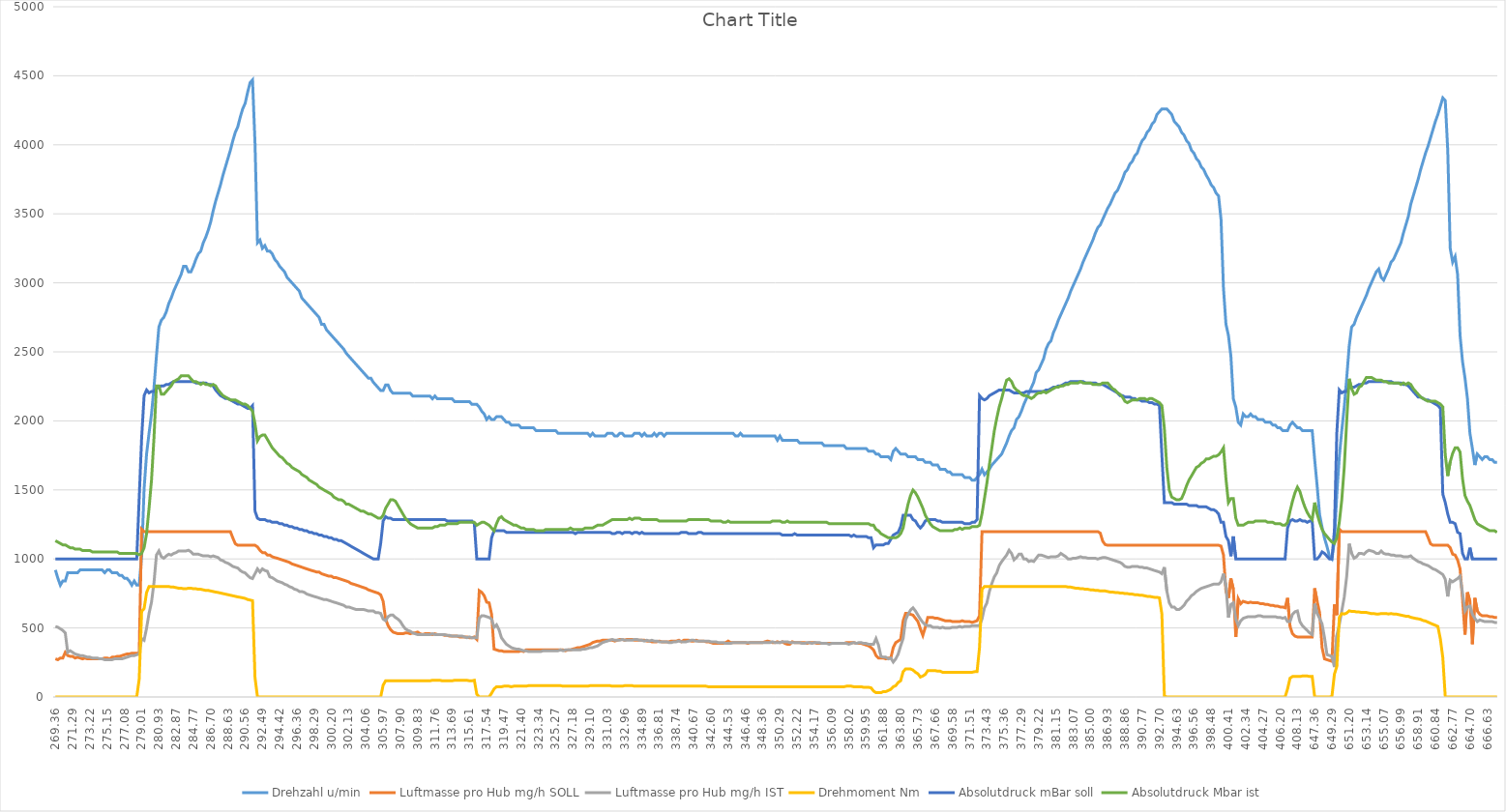
| Category | Drehzahl u/min | Luftmasse pro Hub mg/h SOLL | Luftmasse pro Hub mg/h IST | Drehmoment Nm | Absolutdruck mBar soll | Absolutdruck Mbar ist |
|---|---|---|---|---|---|---|
| 269.36 | 920 | 276 | 511 | 0 | 1000 | 1132 |
| 269.63 | 860 | 270 | 505 | 0 | 1000 | 1122 |
| 269.92 | 810 | 282 | 494 | 0 | 1000 | 1112 |
| 270.19 | 840 | 282 | 482 | 0 | 1000 | 1102 |
| 270.46 | 840 | 323 | 464 | 0 | 1000 | 1102 |
| 270.75 | 900 | 300 | 323 | 0 | 1000 | 1091 |
| 271.02 | 900 | 294 | 335 | 0 | 1000 | 1081 |
| 271.29 | 900 | 294 | 323 | 0 | 1000 | 1081 |
| 271.56 | 900 | 282 | 311 | 0 | 1000 | 1071 |
| 271.85 | 900 | 288 | 306 | 0 | 1000 | 1071 |
| 272.12 | 920 | 282 | 300 | 0 | 1000 | 1071 |
| 272.39 | 920 | 276 | 300 | 0 | 1000 | 1061 |
| 272.66 | 920 | 282 | 294 | 0 | 1000 | 1061 |
| 272.95 | 920 | 276 | 288 | 0 | 1000 | 1061 |
| 273.22 | 920 | 276 | 288 | 0 | 1000 | 1061 |
| 273.49 | 920 | 276 | 282 | 0 | 1000 | 1051 |
| 273.78 | 920 | 276 | 282 | 0 | 1000 | 1051 |
| 274.05 | 920 | 276 | 282 | 0 | 1000 | 1051 |
| 274.32 | 920 | 276 | 276 | 0 | 1000 | 1051 |
| 274.59 | 920 | 276 | 276 | 0 | 1000 | 1051 |
| 274.88 | 900 | 282 | 270 | 0 | 1000 | 1051 |
| 275.15 | 920 | 282 | 270 | 0 | 1000 | 1051 |
| 275.42 | 920 | 276 | 270 | 0 | 1000 | 1051 |
| 275.69 | 900 | 288 | 270 | 0 | 1000 | 1051 |
| 275.98 | 900 | 288 | 276 | 0 | 1000 | 1051 |
| 276.25 | 900 | 294 | 276 | 0 | 1000 | 1051 |
| 276.52 | 880 | 294 | 276 | 0 | 1000 | 1040 |
| 276.81 | 880 | 300 | 276 | 0 | 1000 | 1040 |
| 277.08 | 860 | 306 | 282 | 0 | 1000 | 1040 |
| 277.35 | 860 | 311 | 288 | 0 | 1000 | 1040 |
| 277.62 | 840 | 311 | 294 | 0 | 1000 | 1040 |
| 277.91 | 810 | 317 | 300 | 0 | 1000 | 1040 |
| 278.17 | 840 | 317 | 300 | 0 | 1000 | 1040 |
| 278.45 | 810 | 317 | 306 | 0 | 1000 | 1040 |
| 278.71 | 810 | 317 | 311 | 129 | 1438 | 1030 |
| 279.01 | 1020 | 1216 | 423 | 620 | 1877 | 1040 |
| 279.27 | 1510 | 1198 | 411 | 640 | 2183 | 1081 |
| 279.54 | 1760 | 1198 | 499 | 757 | 2224 | 1183 |
| 279.83 | 1910 | 1198 | 605 | 800 | 2203 | 1367 |
| 280.11 | 2050 | 1198 | 687 | 800 | 2213 | 1571 |
| 280.38 | 2240 | 1198 | 828 | 800 | 2213 | 1877 |
| 280.64 | 2470 | 1198 | 1028 | 800 | 2234 | 2254 |
| 280.93 | 2680 | 1198 | 1058 | 800 | 2244 | 2254 |
| 281.21 | 2730 | 1198 | 1016 | 800 | 2254 | 2193 |
| 281.47 | 2750 | 1198 | 1005 | 800 | 2254 | 2193 |
| 281.74 | 2790 | 1198 | 1022 | 800 | 2264 | 2213 |
| 282.03 | 2850 | 1198 | 1034 | 800 | 2264 | 2234 |
| 282.30 | 2890 | 1198 | 1028 | 796 | 2275 | 2254 |
| 282.57 | 2940 | 1198 | 1040 | 796 | 2285 | 2285 |
| 282.87 | 2980 | 1198 | 1046 | 792 | 2285 | 2295 |
| 283.13 | 3020 | 1198 | 1058 | 788 | 2285 | 2305 |
| 283.40 | 3060 | 1198 | 1058 | 788 | 2285 | 2326 |
| 283.67 | 3120 | 1198 | 1058 | 784 | 2285 | 2326 |
| 283.96 | 3120 | 1198 | 1058 | 784 | 2285 | 2326 |
| 284.23 | 3080 | 1198 | 1063 | 788 | 2285 | 2326 |
| 284.50 | 3080 | 1198 | 1052 | 788 | 2285 | 2305 |
| 284.77 | 3120 | 1198 | 1034 | 784 | 2285 | 2285 |
| 285.06 | 3170 | 1198 | 1034 | 784 | 2275 | 2285 |
| 285.33 | 3210 | 1198 | 1034 | 780 | 2275 | 2275 |
| 285.60 | 3230 | 1198 | 1028 | 780 | 2275 | 2264 |
| 285.89 | 3290 | 1198 | 1022 | 776 | 2275 | 2275 |
| 286.16 | 3330 | 1198 | 1022 | 772 | 2275 | 2264 |
| 286.43 | 3380 | 1198 | 1022 | 772 | 2264 | 2264 |
| 286.70 | 3440 | 1198 | 1016 | 768 | 2264 | 2254 |
| 286.99 | 3520 | 1198 | 1022 | 764 | 2254 | 2264 |
| 287.26 | 3590 | 1198 | 1016 | 760 | 2224 | 2254 |
| 287.53 | 3650 | 1198 | 1010 | 757 | 2203 | 2224 |
| 287.80 | 3710 | 1198 | 993 | 753 | 2183 | 2203 |
| 288.09 | 3780 | 1198 | 987 | 749 | 2173 | 2183 |
| 288.36 | 3840 | 1198 | 975 | 745 | 2162 | 2173 |
| 288.63 | 3900 | 1198 | 969 | 741 | 2162 | 2162 |
| 288.92 | 3960 | 1198 | 958 | 737 | 2152 | 2152 |
| 289.19 | 4030 | 1152 | 946 | 733 | 2142 | 2152 |
| 289.46 | 4090 | 1110 | 940 | 729 | 2132 | 2152 |
| 289.73 | 4130 | 1099 | 934 | 725 | 2122 | 2142 |
| 290.02 | 4200 | 1099 | 916 | 722 | 2122 | 2132 |
| 290.29 | 4260 | 1099 | 905 | 718 | 2111 | 2122 |
| 290.56 | 4300 | 1099 | 899 | 714 | 2101 | 2122 |
| 290.83 | 4380 | 1099 | 881 | 706 | 2091 | 2111 |
| 291.12 | 4450 | 1099 | 864 | 702 | 2091 | 2091 |
| 291.39 | 4470 | 1099 | 858 | 698 | 2111 | 2071 |
| 291.66 | 4010 | 1099 | 893 | 140 | 1346 | 1979 |
| 291.95 | 3290 | 1087 | 928 | 0 | 1295 | 1856 |
| 292.22 | 3310 | 1063 | 905 | 0 | 1285 | 1887 |
| 292.49 | 3250 | 1046 | 928 | 0 | 1285 | 1897 |
| 292.76 | 3270 | 1046 | 916 | 0 | 1285 | 1897 |
| 293.05 | 3230 | 1028 | 911 | 0 | 1275 | 1867 |
| 293.32 | 3230 | 1028 | 870 | 0 | 1275 | 1836 |
| 293.59 | 3210 | 1016 | 864 | 0 | 1265 | 1805 |
| 293.87 | 3170 | 1010 | 852 | 0 | 1265 | 1785 |
| 294.15 | 3150 | 1005 | 840 | 0 | 1265 | 1765 |
| 294.42 | 3120 | 999 | 834 | 0 | 1255 | 1744 |
| 294.69 | 3100 | 993 | 828 | 0 | 1255 | 1734 |
| 294.98 | 3080 | 987 | 817 | 0 | 1244 | 1714 |
| 295.25 | 3040 | 981 | 811 | 0 | 1244 | 1693 |
| 295.53 | 3020 | 975 | 799 | 0 | 1234 | 1683 |
| 295.79 | 3000 | 964 | 793 | 0 | 1234 | 1663 |
| 296.09 | 2980 | 958 | 781 | 0 | 1224 | 1652 |
| 296.36 | 2960 | 952 | 776 | 0 | 1224 | 1642 |
| 296.63 | 2940 | 946 | 764 | 0 | 1214 | 1632 |
| 296.89 | 2890 | 940 | 764 | 0 | 1214 | 1612 |
| 297.19 | 2870 | 934 | 758 | 0 | 1204 | 1601 |
| 297.46 | 2850 | 928 | 746 | 0 | 1204 | 1591 |
| 297.72 | 2830 | 922 | 740 | 0 | 1193 | 1571 |
| 298.01 | 2810 | 916 | 734 | 0 | 1193 | 1561 |
| 298.29 | 2790 | 911 | 728 | 0 | 1183 | 1550 |
| 298.55 | 2770 | 905 | 723 | 0 | 1183 | 1540 |
| 298.82 | 2750 | 905 | 717 | 0 | 1173 | 1520 |
| 299.11 | 2700 | 893 | 711 | 0 | 1173 | 1510 |
| 299.38 | 2700 | 887 | 705 | 0 | 1163 | 1499 |
| 299.65 | 2660 | 881 | 705 | 0 | 1163 | 1489 |
| 299.92 | 2640 | 875 | 699 | 0 | 1153 | 1479 |
| 300.20 | 2620 | 875 | 693 | 0 | 1153 | 1469 |
| 300.48 | 2600 | 864 | 687 | 0 | 1142 | 1448 |
| 300.74 | 2580 | 864 | 682 | 0 | 1142 | 1438 |
| 301.03 | 2560 | 858 | 676 | 0 | 1132 | 1428 |
| 301.30 | 2540 | 852 | 670 | 0 | 1132 | 1428 |
| 301.57 | 2520 | 846 | 664 | 0 | 1122 | 1418 |
| 301.84 | 2490 | 840 | 652 | 0 | 1112 | 1397 |
| 302.13 | 2470 | 834 | 652 | 0 | 1102 | 1397 |
| 302.40 | 2450 | 822 | 646 | 0 | 1091 | 1387 |
| 302.67 | 2430 | 817 | 640 | 0 | 1081 | 1377 |
| 302.94 | 2410 | 811 | 634 | 0 | 1071 | 1367 |
| 303.23 | 2390 | 805 | 634 | 0 | 1061 | 1357 |
| 303.51 | 2370 | 799 | 634 | 0 | 1051 | 1346 |
| 303.77 | 2350 | 793 | 634 | 0 | 1040 | 1346 |
| 304.06 | 2330 | 787 | 629 | 0 | 1030 | 1336 |
| 304.33 | 2310 | 776 | 623 | 0 | 1020 | 1326 |
| 304.60 | 2310 | 770 | 623 | 0 | 1010 | 1326 |
| 304.87 | 2280 | 764 | 623 | 0 | 1000 | 1316 |
| 305.16 | 2260 | 758 | 611 | 0 | 1000 | 1306 |
| 305.43 | 2240 | 752 | 611 | 0 | 1000 | 1295 |
| 305.70 | 2220 | 740 | 605 | 0 | 1112 | 1295 |
| 305.97 | 2220 | 693 | 564 | 86 | 1275 | 1316 |
| 306.26 | 2260 | 564 | 552 | 117 | 1306 | 1367 |
| 306.53 | 2260 | 517 | 582 | 117 | 1295 | 1397 |
| 306.80 | 2220 | 488 | 593 | 117 | 1295 | 1428 |
| 307.09 | 2200 | 470 | 593 | 117 | 1285 | 1428 |
| 307.36 | 2200 | 464 | 576 | 117 | 1285 | 1418 |
| 307.63 | 2200 | 458 | 564 | 117 | 1285 | 1387 |
| 307.90 | 2200 | 458 | 546 | 117 | 1285 | 1357 |
| 308.19 | 2200 | 458 | 517 | 117 | 1285 | 1326 |
| 308.46 | 2200 | 464 | 494 | 117 | 1285 | 1295 |
| 308.73 | 2200 | 464 | 482 | 117 | 1285 | 1275 |
| 309.00 | 2200 | 458 | 476 | 117 | 1285 | 1255 |
| 309.29 | 2180 | 464 | 464 | 117 | 1285 | 1244 |
| 309.56 | 2180 | 464 | 458 | 117 | 1285 | 1234 |
| 309.83 | 2180 | 470 | 452 | 117 | 1285 | 1224 |
| 310.12 | 2180 | 458 | 452 | 117 | 1285 | 1224 |
| 310.39 | 2180 | 452 | 452 | 117 | 1285 | 1224 |
| 310.66 | 2180 | 458 | 452 | 117 | 1285 | 1224 |
| 310.93 | 2180 | 458 | 452 | 117 | 1285 | 1224 |
| 311.22 | 2180 | 458 | 452 | 117 | 1285 | 1224 |
| 311.49 | 2160 | 452 | 458 | 121 | 1285 | 1224 |
| 311.76 | 2180 | 458 | 452 | 121 | 1285 | 1234 |
| 312.02 | 2160 | 452 | 452 | 121 | 1285 | 1234 |
| 312.31 | 2160 | 452 | 452 | 121 | 1285 | 1244 |
| 312.58 | 2160 | 452 | 452 | 117 | 1285 | 1244 |
| 312.86 | 2160 | 446 | 452 | 117 | 1285 | 1244 |
| 313.15 | 2160 | 446 | 446 | 117 | 1275 | 1255 |
| 313.41 | 2160 | 441 | 446 | 117 | 1275 | 1255 |
| 313.69 | 2160 | 441 | 441 | 117 | 1275 | 1255 |
| 313.96 | 2140 | 441 | 441 | 121 | 1275 | 1255 |
| 314.25 | 2140 | 441 | 441 | 121 | 1275 | 1255 |
| 314.51 | 2140 | 435 | 441 | 121 | 1275 | 1265 |
| 314.78 | 2140 | 435 | 441 | 121 | 1275 | 1265 |
| 315.05 | 2140 | 435 | 435 | 121 | 1275 | 1265 |
| 315.35 | 2140 | 435 | 429 | 121 | 1275 | 1265 |
| 315.61 | 2140 | 429 | 435 | 117 | 1275 | 1265 |
| 315.88 | 2120 | 429 | 429 | 117 | 1275 | 1265 |
| 316.17 | 2120 | 435 | 429 | 121 | 1255 | 1265 |
| 316.44 | 2120 | 417 | 429 | 20 | 1000 | 1244 |
| 316.71 | 2100 | 770 | 570 | 0 | 1000 | 1255 |
| 316.98 | 2070 | 758 | 588 | 0 | 1000 | 1265 |
| 317.27 | 2050 | 734 | 588 | 0 | 1000 | 1265 |
| 317.54 | 2010 | 687 | 582 | 0 | 1000 | 1255 |
| 317.81 | 2030 | 682 | 576 | 0 | 1000 | 1244 |
| 318.09 | 2010 | 599 | 564 | 27 | 1153 | 1224 |
| 318.37 | 2010 | 347 | 505 | 58 | 1204 | 1204 |
| 318.64 | 2030 | 341 | 523 | 74 | 1204 | 1255 |
| 318.91 | 2030 | 335 | 488 | 74 | 1204 | 1295 |
| 319.20 | 2030 | 335 | 429 | 74 | 1204 | 1306 |
| 319.47 | 2010 | 329 | 405 | 78 | 1204 | 1285 |
| 319.74 | 1990 | 329 | 382 | 78 | 1193 | 1275 |
| 320.01 | 1990 | 329 | 370 | 78 | 1193 | 1265 |
| 320.30 | 1970 | 329 | 358 | 74 | 1193 | 1255 |
| 320.57 | 1970 | 329 | 352 | 78 | 1193 | 1244 |
| 320.84 | 1970 | 329 | 347 | 78 | 1193 | 1244 |
| 321.11 | 1970 | 329 | 347 | 78 | 1193 | 1234 |
| 321.40 | 1950 | 335 | 341 | 78 | 1193 | 1224 |
| 321.67 | 1950 | 329 | 335 | 78 | 1193 | 1224 |
| 321.94 | 1950 | 341 | 335 | 78 | 1193 | 1214 |
| 322.23 | 1950 | 341 | 329 | 82 | 1193 | 1214 |
| 322.50 | 1950 | 341 | 329 | 82 | 1193 | 1214 |
| 322.77 | 1950 | 341 | 329 | 82 | 1193 | 1214 |
| 323.04 | 1930 | 341 | 329 | 82 | 1193 | 1204 |
| 323.34 | 1930 | 341 | 329 | 82 | 1193 | 1204 |
| 323.60 | 1930 | 341 | 329 | 82 | 1193 | 1204 |
| 323.88 | 1930 | 341 | 335 | 82 | 1193 | 1204 |
| 324.15 | 1930 | 341 | 335 | 82 | 1193 | 1214 |
| 324.44 | 1930 | 341 | 335 | 82 | 1193 | 1214 |
| 324.71 | 1930 | 341 | 335 | 82 | 1193 | 1214 |
| 324.98 | 1930 | 341 | 335 | 82 | 1193 | 1214 |
| 325.27 | 1930 | 341 | 335 | 82 | 1193 | 1214 |
| 325.54 | 1910 | 341 | 335 | 82 | 1193 | 1214 |
| 325.81 | 1910 | 341 | 341 | 82 | 1193 | 1214 |
| 326.08 | 1910 | 341 | 335 | 78 | 1193 | 1214 |
| 326.37 | 1910 | 335 | 341 | 78 | 1193 | 1214 |
| 326.64 | 1910 | 341 | 341 | 78 | 1193 | 1214 |
| 326.91 | 1910 | 341 | 341 | 78 | 1193 | 1224 |
| 327.18 | 1910 | 347 | 341 | 78 | 1193 | 1214 |
| 327.47 | 1910 | 352 | 341 | 78 | 1183 | 1214 |
| 327.74 | 1910 | 358 | 341 | 78 | 1193 | 1214 |
| 328.01 | 1910 | 358 | 341 | 78 | 1193 | 1214 |
| 328.29 | 1910 | 364 | 347 | 78 | 1193 | 1214 |
| 328.57 | 1910 | 370 | 347 | 78 | 1193 | 1224 |
| 328.84 | 1910 | 376 | 352 | 78 | 1193 | 1224 |
| 329.10 | 1890 | 382 | 358 | 82 | 1193 | 1224 |
| 329.39 | 1910 | 394 | 358 | 82 | 1193 | 1224 |
| 329.66 | 1890 | 400 | 364 | 82 | 1193 | 1234 |
| 329.93 | 1890 | 405 | 370 | 82 | 1193 | 1244 |
| 330.21 | 1890 | 405 | 382 | 82 | 1193 | 1244 |
| 330.49 | 1890 | 411 | 394 | 82 | 1193 | 1244 |
| 330.76 | 1890 | 411 | 400 | 82 | 1193 | 1255 |
| 331.03 | 1910 | 411 | 405 | 82 | 1193 | 1265 |
| 331.32 | 1910 | 411 | 411 | 82 | 1193 | 1275 |
| 331.59 | 1910 | 411 | 417 | 78 | 1183 | 1285 |
| 331.86 | 1890 | 405 | 411 | 78 | 1183 | 1285 |
| 332.13 | 1890 | 411 | 411 | 78 | 1193 | 1285 |
| 332.42 | 1910 | 417 | 411 | 78 | 1193 | 1285 |
| 332.69 | 1910 | 417 | 417 | 78 | 1183 | 1285 |
| 332.96 | 1890 | 411 | 411 | 82 | 1193 | 1285 |
| 333.23 | 1890 | 417 | 411 | 82 | 1193 | 1285 |
| 333.52 | 1890 | 417 | 411 | 82 | 1193 | 1295 |
| 333.79 | 1890 | 417 | 411 | 82 | 1183 | 1285 |
| 334.06 | 1910 | 411 | 417 | 78 | 1193 | 1295 |
| 334.35 | 1910 | 411 | 417 | 78 | 1193 | 1295 |
| 334.62 | 1910 | 411 | 411 | 78 | 1183 | 1295 |
| 334.89 | 1890 | 411 | 411 | 78 | 1193 | 1285 |
| 335.16 | 1910 | 411 | 405 | 78 | 1183 | 1285 |
| 335.44 | 1890 | 405 | 411 | 78 | 1183 | 1285 |
| 335.71 | 1890 | 405 | 405 | 78 | 1183 | 1285 |
| 335.98 | 1890 | 400 | 411 | 78 | 1183 | 1285 |
| 336.25 | 1910 | 400 | 405 | 78 | 1183 | 1285 |
| 336.54 | 1890 | 400 | 405 | 78 | 1183 | 1285 |
| 336.81 | 1910 | 405 | 400 | 78 | 1183 | 1275 |
| 337.08 | 1910 | 400 | 400 | 78 | 1183 | 1275 |
| 337.37 | 1890 | 400 | 400 | 78 | 1183 | 1275 |
| 337.64 | 1910 | 400 | 400 | 78 | 1183 | 1275 |
| 337.91 | 1910 | 400 | 394 | 78 | 1183 | 1275 |
| 338.18 | 1910 | 405 | 394 | 78 | 1183 | 1275 |
| 338.47 | 1910 | 405 | 400 | 78 | 1183 | 1275 |
| 338.74 | 1910 | 405 | 400 | 78 | 1183 | 1275 |
| 339.01 | 1910 | 411 | 405 | 78 | 1183 | 1275 |
| 339.28 | 1910 | 400 | 400 | 78 | 1193 | 1275 |
| 339.57 | 1910 | 411 | 400 | 78 | 1193 | 1275 |
| 339.84 | 1910 | 411 | 400 | 78 | 1193 | 1275 |
| 340.11 | 1910 | 411 | 405 | 78 | 1183 | 1285 |
| 340.40 | 1910 | 405 | 411 | 78 | 1183 | 1285 |
| 340.67 | 1910 | 405 | 411 | 78 | 1183 | 1285 |
| 340.94 | 1910 | 411 | 405 | 78 | 1183 | 1285 |
| 341.21 | 1910 | 405 | 405 | 78 | 1193 | 1285 |
| 341.50 | 1910 | 405 | 405 | 78 | 1193 | 1285 |
| 341.77 | 1910 | 405 | 405 | 78 | 1183 | 1285 |
| 342.04 | 1910 | 400 | 405 | 78 | 1183 | 1285 |
| 342.31 | 1910 | 400 | 405 | 74 | 1183 | 1285 |
| 342.60 | 1910 | 394 | 400 | 74 | 1183 | 1275 |
| 342.87 | 1910 | 388 | 400 | 74 | 1183 | 1275 |
| 343.14 | 1910 | 388 | 400 | 74 | 1183 | 1275 |
| 343.43 | 1910 | 388 | 394 | 74 | 1183 | 1275 |
| 343.70 | 1910 | 388 | 394 | 74 | 1183 | 1275 |
| 343.97 | 1910 | 388 | 394 | 74 | 1183 | 1265 |
| 344.24 | 1910 | 394 | 388 | 74 | 1183 | 1265 |
| 344.53 | 1910 | 405 | 388 | 74 | 1183 | 1275 |
| 344.80 | 1910 | 394 | 388 | 74 | 1183 | 1265 |
| 345.07 | 1910 | 394 | 394 | 74 | 1183 | 1265 |
| 345.34 | 1890 | 394 | 394 | 74 | 1183 | 1265 |
| 345.63 | 1890 | 394 | 394 | 74 | 1183 | 1265 |
| 345.90 | 1910 | 394 | 394 | 74 | 1183 | 1265 |
| 346.16 | 1890 | 394 | 394 | 74 | 1183 | 1265 |
| 346.46 | 1890 | 394 | 394 | 74 | 1183 | 1265 |
| 346.73 | 1890 | 388 | 394 | 74 | 1183 | 1265 |
| 347.00 | 1890 | 394 | 394 | 74 | 1183 | 1265 |
| 347.27 | 1890 | 394 | 394 | 74 | 1183 | 1265 |
| 347.55 | 1890 | 394 | 394 | 74 | 1183 | 1265 |
| 347.82 | 1890 | 394 | 394 | 74 | 1183 | 1265 |
| 348.10 | 1890 | 394 | 394 | 74 | 1183 | 1265 |
| 348.36 | 1890 | 394 | 394 | 74 | 1183 | 1265 |
| 348.65 | 1890 | 400 | 394 | 74 | 1183 | 1265 |
| 348.93 | 1890 | 405 | 394 | 74 | 1183 | 1265 |
| 349.19 | 1890 | 400 | 394 | 74 | 1183 | 1265 |
| 349.48 | 1890 | 394 | 400 | 74 | 1183 | 1275 |
| 349.75 | 1890 | 394 | 394 | 74 | 1183 | 1275 |
| 350.02 | 1860 | 400 | 394 | 74 | 1183 | 1275 |
| 350.29 | 1890 | 394 | 394 | 74 | 1183 | 1275 |
| 350.58 | 1860 | 400 | 400 | 74 | 1173 | 1265 |
| 350.85 | 1860 | 388 | 400 | 74 | 1173 | 1265 |
| 351.12 | 1860 | 382 | 400 | 74 | 1173 | 1275 |
| 351.39 | 1860 | 382 | 394 | 74 | 1173 | 1265 |
| 351.68 | 1860 | 400 | 394 | 74 | 1173 | 1265 |
| 351.95 | 1860 | 394 | 394 | 74 | 1183 | 1265 |
| 352.22 | 1860 | 394 | 394 | 74 | 1173 | 1265 |
| 352.52 | 1840 | 394 | 394 | 74 | 1173 | 1265 |
| 352.79 | 1840 | 394 | 388 | 74 | 1173 | 1265 |
| 353.06 | 1840 | 394 | 388 | 74 | 1173 | 1265 |
| 353.33 | 1840 | 388 | 394 | 74 | 1173 | 1265 |
| 353.63 | 1840 | 394 | 394 | 74 | 1173 | 1265 |
| 353.90 | 1840 | 394 | 388 | 74 | 1173 | 1265 |
| 354.17 | 1840 | 394 | 394 | 74 | 1173 | 1265 |
| 354.45 | 1840 | 388 | 394 | 74 | 1173 | 1265 |
| 354.73 | 1840 | 388 | 394 | 74 | 1173 | 1265 |
| 355.00 | 1840 | 388 | 388 | 74 | 1173 | 1265 |
| 355.28 | 1820 | 388 | 388 | 74 | 1173 | 1265 |
| 355.55 | 1820 | 388 | 388 | 74 | 1173 | 1265 |
| 355.82 | 1820 | 388 | 382 | 74 | 1173 | 1255 |
| 356.09 | 1820 | 388 | 388 | 74 | 1173 | 1255 |
| 356.36 | 1820 | 388 | 388 | 74 | 1173 | 1255 |
| 356.65 | 1820 | 388 | 388 | 74 | 1173 | 1255 |
| 356.92 | 1820 | 388 | 388 | 74 | 1173 | 1255 |
| 357.19 | 1820 | 388 | 388 | 74 | 1173 | 1255 |
| 357.46 | 1820 | 388 | 388 | 74 | 1173 | 1255 |
| 357.75 | 1800 | 394 | 388 | 78 | 1173 | 1255 |
| 358.02 | 1800 | 394 | 382 | 78 | 1173 | 1255 |
| 358.29 | 1800 | 394 | 388 | 78 | 1163 | 1255 |
| 358.58 | 1800 | 394 | 394 | 74 | 1173 | 1255 |
| 358.85 | 1800 | 388 | 388 | 74 | 1163 | 1255 |
| 359.12 | 1800 | 388 | 394 | 74 | 1163 | 1255 |
| 359.39 | 1800 | 388 | 394 | 74 | 1163 | 1255 |
| 359.68 | 1800 | 382 | 388 | 70 | 1163 | 1255 |
| 359.95 | 1800 | 376 | 388 | 70 | 1163 | 1255 |
| 360.22 | 1780 | 370 | 382 | 70 | 1153 | 1255 |
| 360.49 | 1780 | 358 | 382 | 66 | 1153 | 1244 |
| 360.78 | 1780 | 341 | 382 | 43 | 1081 | 1244 |
| 361.05 | 1760 | 300 | 423 | 31 | 1102 | 1214 |
| 361.32 | 1760 | 282 | 376 | 31 | 1102 | 1204 |
| 361.61 | 1740 | 282 | 294 | 31 | 1102 | 1183 |
| 361.88 | 1740 | 282 | 288 | 39 | 1102 | 1173 |
| 362.15 | 1740 | 276 | 288 | 39 | 1112 | 1163 |
| 362.42 | 1740 | 282 | 276 | 47 | 1112 | 1153 |
| 362.71 | 1720 | 282 | 282 | 55 | 1142 | 1153 |
| 362.98 | 1780 | 358 | 253 | 74 | 1173 | 1153 |
| 363.25 | 1800 | 394 | 276 | 82 | 1183 | 1153 |
| 363.52 | 1780 | 405 | 311 | 105 | 1193 | 1163 |
| 363.80 | 1760 | 417 | 370 | 117 | 1234 | 1183 |
| 364.08 | 1760 | 552 | 423 | 183 | 1316 | 1224 |
| 364.35 | 1760 | 605 | 558 | 203 | 1316 | 1316 |
| 364.63 | 1740 | 605 | 599 | 203 | 1316 | 1397 |
| 364.90 | 1740 | 599 | 629 | 203 | 1316 | 1459 |
| 365.17 | 1740 | 593 | 646 | 195 | 1285 | 1499 |
| 365.44 | 1740 | 570 | 623 | 179 | 1275 | 1479 |
| 365.73 | 1720 | 546 | 593 | 168 | 1244 | 1448 |
| 366.01 | 1720 | 494 | 564 | 144 | 1224 | 1408 |
| 366.27 | 1720 | 446 | 540 | 152 | 1244 | 1367 |
| 366.54 | 1700 | 505 | 523 | 164 | 1275 | 1316 |
| 366.83 | 1700 | 576 | 517 | 191 | 1285 | 1285 |
| 367.10 | 1700 | 576 | 517 | 191 | 1285 | 1255 |
| 367.37 | 1680 | 576 | 505 | 191 | 1285 | 1234 |
| 367.66 | 1680 | 570 | 505 | 191 | 1285 | 1224 |
| 367.93 | 1680 | 570 | 505 | 187 | 1275 | 1214 |
| 368.21 | 1650 | 564 | 499 | 187 | 1275 | 1204 |
| 368.48 | 1650 | 558 | 505 | 179 | 1265 | 1204 |
| 368.77 | 1650 | 552 | 499 | 179 | 1265 | 1204 |
| 369.04 | 1630 | 552 | 499 | 179 | 1265 | 1204 |
| 369.31 | 1630 | 552 | 499 | 179 | 1265 | 1204 |
| 369.58 | 1610 | 546 | 505 | 179 | 1265 | 1204 |
| 369.87 | 1610 | 546 | 505 | 179 | 1265 | 1214 |
| 370.15 | 1610 | 546 | 505 | 179 | 1265 | 1214 |
| 370.41 | 1610 | 546 | 511 | 179 | 1265 | 1224 |
| 370.70 | 1610 | 552 | 505 | 179 | 1265 | 1214 |
| 370.97 | 1590 | 546 | 511 | 179 | 1255 | 1224 |
| 371.24 | 1590 | 546 | 511 | 179 | 1255 | 1224 |
| 371.51 | 1590 | 546 | 511 | 179 | 1255 | 1224 |
| 371.80 | 1570 | 540 | 517 | 179 | 1265 | 1234 |
| 372.07 | 1570 | 546 | 517 | 183 | 1265 | 1234 |
| 372.34 | 1590 | 552 | 517 | 183 | 1285 | 1234 |
| 372.61 | 1610 | 588 | 517 | 359 | 2183 | 1244 |
| 372.89 | 1650 | 1198 | 564 | 780 | 2162 | 1326 |
| 373.16 | 1610 | 1198 | 646 | 800 | 2152 | 1438 |
| 373.43 | 1630 | 1198 | 682 | 800 | 2162 | 1550 |
| 373.72 | 1650 | 1198 | 764 | 800 | 2183 | 1683 |
| 373.99 | 1680 | 1198 | 822 | 800 | 2193 | 1805 |
| 374.26 | 1700 | 1198 | 870 | 800 | 2203 | 1928 |
| 374.53 | 1720 | 1198 | 899 | 800 | 2213 | 2020 |
| 374.82 | 1740 | 1198 | 952 | 800 | 2224 | 2101 |
| 375.09 | 1760 | 1198 | 981 | 800 | 2224 | 2162 |
| 375.36 | 1800 | 1198 | 1005 | 800 | 2224 | 2234 |
| 375.63 | 1840 | 1198 | 1028 | 800 | 2224 | 2295 |
| 375.92 | 1890 | 1198 | 1063 | 800 | 2224 | 2305 |
| 376.19 | 1930 | 1198 | 1040 | 800 | 2213 | 2285 |
| 376.46 | 1950 | 1198 | 993 | 800 | 2203 | 2244 |
| 376.75 | 2010 | 1198 | 1010 | 800 | 2203 | 2224 |
| 377.02 | 2030 | 1198 | 1034 | 800 | 2203 | 2213 |
| 377.29 | 2070 | 1198 | 1034 | 800 | 2203 | 2193 |
| 377.56 | 2120 | 1198 | 999 | 800 | 2203 | 2183 |
| 377.85 | 2160 | 1198 | 999 | 800 | 2213 | 2183 |
| 378.12 | 2200 | 1198 | 981 | 800 | 2213 | 2173 |
| 378.39 | 2240 | 1198 | 987 | 800 | 2213 | 2162 |
| 378.66 | 2280 | 1198 | 981 | 800 | 2213 | 2173 |
| 378.95 | 2350 | 1198 | 1005 | 800 | 2213 | 2193 |
| 379.22 | 2370 | 1198 | 1028 | 800 | 2213 | 2203 |
| 379.49 | 2410 | 1198 | 1028 | 800 | 2213 | 2203 |
| 379.78 | 2450 | 1198 | 1022 | 800 | 2213 | 2213 |
| 380.05 | 2520 | 1198 | 1016 | 800 | 2224 | 2203 |
| 380.32 | 2560 | 1198 | 1010 | 800 | 2224 | 2213 |
| 380.59 | 2580 | 1198 | 1016 | 800 | 2234 | 2224 |
| 380.87 | 2640 | 1198 | 1016 | 800 | 2244 | 2234 |
| 381.15 | 2680 | 1198 | 1016 | 800 | 2244 | 2244 |
| 381.42 | 2730 | 1198 | 1022 | 800 | 2254 | 2244 |
| 381.68 | 2770 | 1198 | 1040 | 800 | 2254 | 2254 |
| 381.97 | 2810 | 1198 | 1028 | 800 | 2264 | 2254 |
| 382.24 | 2850 | 1198 | 1016 | 800 | 2275 | 2264 |
| 382.52 | 2890 | 1198 | 999 | 796 | 2275 | 2264 |
| 382.80 | 2940 | 1198 | 999 | 796 | 2285 | 2275 |
| 383.07 | 2980 | 1198 | 1005 | 792 | 2285 | 2275 |
| 383.34 | 3020 | 1198 | 1005 | 788 | 2285 | 2275 |
| 383.61 | 3060 | 1198 | 1010 | 788 | 2285 | 2275 |
| 383.90 | 3100 | 1198 | 1016 | 784 | 2285 | 2285 |
| 384.17 | 3150 | 1198 | 1010 | 784 | 2285 | 2275 |
| 384.44 | 3190 | 1198 | 1010 | 780 | 2275 | 2275 |
| 384.71 | 3230 | 1198 | 1005 | 780 | 2275 | 2275 |
| 385.00 | 3270 | 1198 | 1005 | 776 | 2275 | 2275 |
| 385.27 | 3310 | 1198 | 1005 | 776 | 2275 | 2264 |
| 385.54 | 3360 | 1198 | 1005 | 772 | 2275 | 2264 |
| 385.83 | 3400 | 1198 | 999 | 772 | 2264 | 2264 |
| 386.10 | 3420 | 1187 | 1005 | 768 | 2264 | 2264 |
| 386.37 | 3460 | 1128 | 1010 | 768 | 2264 | 2275 |
| 386.64 | 3500 | 1104 | 1010 | 768 | 2254 | 2275 |
| 386.93 | 3540 | 1099 | 1005 | 764 | 2244 | 2275 |
| 387.20 | 3570 | 1099 | 999 | 760 | 2234 | 2254 |
| 387.47 | 3610 | 1099 | 993 | 760 | 2224 | 2234 |
| 387.74 | 3650 | 1099 | 987 | 757 | 2213 | 2224 |
| 388.03 | 3670 | 1099 | 981 | 757 | 2203 | 2203 |
| 388.30 | 3710 | 1099 | 975 | 753 | 2183 | 2193 |
| 388.57 | 3750 | 1099 | 964 | 753 | 2183 | 2173 |
| 388.86 | 3800 | 1099 | 946 | 749 | 2173 | 2142 |
| 389.13 | 3820 | 1099 | 940 | 749 | 2173 | 2132 |
| 389.40 | 3860 | 1099 | 940 | 745 | 2173 | 2142 |
| 389.67 | 3880 | 1099 | 946 | 745 | 2162 | 2152 |
| 389.96 | 3920 | 1099 | 946 | 741 | 2162 | 2152 |
| 390.23 | 3940 | 1099 | 946 | 741 | 2152 | 2152 |
| 390.50 | 3990 | 1099 | 940 | 737 | 2152 | 2162 |
| 390.77 | 4030 | 1099 | 940 | 737 | 2142 | 2162 |
| 391.06 | 4050 | 1099 | 934 | 733 | 2142 | 2162 |
| 391.33 | 4090 | 1099 | 934 | 729 | 2142 | 2152 |
| 391.60 | 4110 | 1099 | 928 | 729 | 2132 | 2162 |
| 391.89 | 4150 | 1099 | 922 | 725 | 2132 | 2162 |
| 392.16 | 4170 | 1099 | 916 | 722 | 2122 | 2152 |
| 392.43 | 4220 | 1099 | 911 | 722 | 2122 | 2142 |
| 392.70 | 4240 | 1099 | 905 | 718 | 2111 | 2132 |
| 392.99 | 4260 | 1099 | 893 | 601 | 1754 | 2111 |
| 393.26 | 4260 | 1099 | 940 | 8 | 1408 | 1948 |
| 393.53 | 4260 | 1099 | 770 | 0 | 1408 | 1663 |
| 393.80 | 4240 | 1099 | 682 | 0 | 1408 | 1499 |
| 394.09 | 4220 | 1099 | 652 | 0 | 1408 | 1448 |
| 394.36 | 4170 | 1099 | 652 | 0 | 1397 | 1438 |
| 394.63 | 4150 | 1099 | 634 | 0 | 1397 | 1428 |
| 394.92 | 4130 | 1099 | 634 | 0 | 1397 | 1428 |
| 395.19 | 4090 | 1099 | 646 | 0 | 1397 | 1438 |
| 395.46 | 4070 | 1099 | 664 | 0 | 1397 | 1479 |
| 395.73 | 4030 | 1099 | 693 | 0 | 1397 | 1530 |
| 396.02 | 4010 | 1099 | 711 | 0 | 1387 | 1571 |
| 396.29 | 3960 | 1099 | 734 | 0 | 1387 | 1601 |
| 396.56 | 3940 | 1099 | 746 | 0 | 1387 | 1632 |
| 396.83 | 3900 | 1099 | 764 | 0 | 1387 | 1663 |
| 397.12 | 3880 | 1099 | 776 | 0 | 1377 | 1673 |
| 397.39 | 3840 | 1099 | 787 | 0 | 1377 | 1693 |
| 397.66 | 3820 | 1099 | 793 | 0 | 1377 | 1703 |
| 397.95 | 3780 | 1099 | 799 | 0 | 1377 | 1724 |
| 398.21 | 3750 | 1099 | 805 | 0 | 1367 | 1724 |
| 398.48 | 3710 | 1099 | 811 | 0 | 1357 | 1734 |
| 398.76 | 3690 | 1099 | 817 | 0 | 1357 | 1744 |
| 399.04 | 3650 | 1099 | 817 | 0 | 1346 | 1744 |
| 399.31 | 3630 | 1099 | 817 | 0 | 1326 | 1754 |
| 399.58 | 3460 | 1093 | 834 | 0 | 1265 | 1775 |
| 399.85 | 2960 | 1028 | 893 | 0 | 1265 | 1805 |
| 400.14 | 2700 | 764 | 805 | 0 | 1163 | 1581 |
| 400.41 | 2620 | 717 | 576 | 0 | 1132 | 1408 |
| 400.68 | 2470 | 858 | 670 | 0 | 1020 | 1438 |
| 400.97 | 2160 | 781 | 682 | 0 | 1163 | 1438 |
| 401.24 | 2100 | 435 | 564 | 0 | 1000 | 1295 |
| 401.51 | 1990 | 711 | 517 | 0 | 1000 | 1244 |
| 401.78 | 1970 | 676 | 552 | 0 | 1000 | 1244 |
| 402.07 | 2050 | 693 | 570 | 0 | 1000 | 1244 |
| 402.34 | 2030 | 687 | 576 | 0 | 1000 | 1255 |
| 402.61 | 2030 | 682 | 582 | 0 | 1000 | 1265 |
| 402.88 | 2050 | 687 | 582 | 0 | 1000 | 1265 |
| 403.17 | 2030 | 682 | 582 | 0 | 1000 | 1265 |
| 403.44 | 2030 | 682 | 582 | 0 | 1000 | 1275 |
| 403.71 | 2010 | 682 | 588 | 0 | 1000 | 1275 |
| 404.00 | 2010 | 676 | 588 | 0 | 1000 | 1275 |
| 404.27 | 2010 | 676 | 582 | 0 | 1000 | 1275 |
| 404.54 | 1990 | 670 | 582 | 0 | 1000 | 1275 |
| 404.81 | 1990 | 670 | 582 | 0 | 1000 | 1265 |
| 405.10 | 1990 | 664 | 582 | 0 | 1000 | 1265 |
| 405.37 | 1970 | 664 | 582 | 0 | 1000 | 1265 |
| 405.64 | 1970 | 658 | 582 | 0 | 1000 | 1255 |
| 405.91 | 1950 | 658 | 576 | 0 | 1000 | 1255 |
| 406.20 | 1950 | 652 | 576 | 0 | 1000 | 1255 |
| 406.47 | 1930 | 652 | 570 | 0 | 1000 | 1244 |
| 406.74 | 1930 | 646 | 576 | 0 | 1000 | 1244 |
| 407.03 | 1930 | 717 | 546 | 58 | 1224 | 1265 |
| 407.30 | 1970 | 511 | 546 | 136 | 1275 | 1346 |
| 407.57 | 1990 | 458 | 599 | 148 | 1285 | 1418 |
| 407.84 | 1970 | 441 | 617 | 148 | 1275 | 1479 |
| 408.13 | 1950 | 435 | 623 | 148 | 1275 | 1520 |
| 408.40 | 1950 | 435 | 546 | 148 | 1285 | 1489 |
| 408.67 | 1930 | 435 | 517 | 152 | 1275 | 1428 |
| 408.94 | 1930 | 435 | 499 | 152 | 1275 | 1377 |
| 409.23 | 1930 | 435 | 482 | 152 | 1265 | 1336 |
| 409.50 | 1930 | 435 | 464 | 148 | 1275 | 1306 |
| 409.77 | 1930 | 435 | 452 | 148 | 1275 | 1285 |
| 647.36 | 1720 | 787 | 676 | 0 | 1000 | 1408 |
| 647.63 | 1530 | 693 | 605 | 0 | 1000 | 1326 |
| 647.90 | 1320 | 611 | 570 | 0 | 1020 | 1265 |
| 648.17 | 1230 | 358 | 529 | 0 | 1051 | 1214 |
| 648.46 | 1150 | 276 | 429 | 0 | 1040 | 1183 |
| 648.73 | 1090 | 270 | 306 | 0 | 1020 | 1163 |
| 649.00 | 1020 | 264 | 300 | 0 | 1000 | 1142 |
| 649.29 | 1000 | 258 | 294 | 4 | 1000 | 1122 |
| 649.56 | 1130 | 670 | 217 | 164 | 1204 | 1112 |
| 649.83 | 1470 | 593 | 446 | 222 | 1918 | 1153 |
| 650.10 | 1740 | 1216 | 523 | 577 | 2224 | 1265 |
| 650.39 | 1930 | 1198 | 623 | 604 | 2203 | 1428 |
| 650.66 | 2100 | 1198 | 723 | 601 | 2213 | 1663 |
| 650.93 | 2310 | 1198 | 875 | 608 | 2213 | 1999 |
| 651.20 | 2540 | 1198 | 1110 | 624 | 2244 | 2305 |
| 651.50 | 2680 | 1198 | 1040 | 620 | 2244 | 2234 |
| 651.77 | 2700 | 1198 | 1005 | 620 | 2244 | 2193 |
| 652.04 | 2750 | 1198 | 1016 | 616 | 2254 | 2203 |
| 652.33 | 2790 | 1198 | 1040 | 616 | 2264 | 2244 |
| 652.60 | 2830 | 1198 | 1040 | 612 | 2264 | 2254 |
| 652.87 | 2870 | 1198 | 1034 | 612 | 2275 | 2285 |
| 653.14 | 2910 | 1198 | 1052 | 612 | 2275 | 2315 |
| 653.43 | 2960 | 1198 | 1063 | 608 | 2285 | 2315 |
| 653.70 | 3000 | 1198 | 1058 | 604 | 2285 | 2315 |
| 653.96 | 3040 | 1198 | 1052 | 604 | 2285 | 2305 |
| 654.24 | 3080 | 1198 | 1040 | 601 | 2285 | 2295 |
| 654.53 | 3100 | 1198 | 1040 | 601 | 2285 | 2295 |
| 654.80 | 3040 | 1198 | 1058 | 604 | 2285 | 2295 |
| 655.07 | 3020 | 1198 | 1040 | 604 | 2285 | 2285 |
| 655.36 | 3060 | 1198 | 1034 | 604 | 2285 | 2285 |
| 655.63 | 3100 | 1198 | 1034 | 601 | 2285 | 2275 |
| 655.90 | 3150 | 1198 | 1028 | 604 | 2285 | 2275 |
| 656.17 | 3170 | 1198 | 1028 | 601 | 2275 | 2275 |
| 656.46 | 3210 | 1198 | 1022 | 601 | 2275 | 2275 |
| 656.73 | 3250 | 1198 | 1022 | 597 | 2275 | 2275 |
| 656.99 | 3290 | 1198 | 1022 | 593 | 2275 | 2264 |
| 657.26 | 3360 | 1198 | 1016 | 589 | 2264 | 2275 |
| 657.54 | 3420 | 1198 | 1016 | 585 | 2264 | 2264 |
| 657.82 | 3480 | 1198 | 1016 | 585 | 2254 | 2275 |
| 658.08 | 3570 | 1198 | 1022 | 577 | 2234 | 2264 |
| 658.37 | 3630 | 1198 | 1005 | 573 | 2213 | 2234 |
| 658.64 | 3690 | 1198 | 993 | 569 | 2193 | 2213 |
| 658.91 | 3750 | 1198 | 981 | 566 | 2173 | 2193 |
| 659.18 | 3820 | 1198 | 975 | 562 | 2173 | 2173 |
| 659.47 | 3880 | 1198 | 964 | 554 | 2162 | 2162 |
| 659.74 | 3940 | 1198 | 958 | 550 | 2152 | 2152 |
| 660.01 | 3990 | 1157 | 952 | 542 | 2152 | 2142 |
| 660.28 | 4050 | 1110 | 940 | 534 | 2142 | 2142 |
| 660.57 | 4110 | 1099 | 928 | 526 | 2132 | 2142 |
| 660.84 | 4170 | 1099 | 922 | 519 | 2122 | 2142 |
| 661.11 | 4220 | 1099 | 911 | 511 | 2111 | 2132 |
| 661.40 | 4280 | 1099 | 899 | 421 | 2091 | 2122 |
| 661.67 | 4340 | 1099 | 887 | 285 | 1469 | 2101 |
| 661.94 | 4320 | 1099 | 852 | 0 | 1408 | 1754 |
| 662.21 | 3960 | 1099 | 728 | 0 | 1326 | 1601 |
| 662.51 | 3250 | 1081 | 846 | 0 | 1265 | 1703 |
| 662.77 | 3150 | 1034 | 834 | 0 | 1265 | 1765 |
| 663.04 | 3190 | 1028 | 846 | 0 | 1255 | 1805 |
| 663.31 | 3060 | 993 | 858 | 0 | 1193 | 1805 |
| 663.60 | 2620 | 928 | 875 | 0 | 1183 | 1775 |
| 663.87 | 2430 | 711 | 752 | 0 | 1040 | 1581 |
| 664.15 | 2310 | 452 | 623 | 0 | 1000 | 1459 |
| 664.43 | 2160 | 758 | 652 | 0 | 1000 | 1418 |
| 664.70 | 1910 | 693 | 658 | 0 | 1081 | 1387 |
| 664.97 | 1800 | 382 | 599 | 0 | 1000 | 1336 |
| 665.24 | 1680 | 717 | 570 | 0 | 1000 | 1285 |
| 665.53 | 1760 | 623 | 546 | 0 | 1000 | 1255 |
| 665.80 | 1740 | 599 | 558 | 0 | 1000 | 1244 |
| 666.07 | 1720 | 588 | 552 | 0 | 1000 | 1234 |
| 666.34 | 1740 | 588 | 546 | 0 | 1000 | 1224 |
| 666.63 | 1740 | 588 | 546 | 0 | 1000 | 1214 |
| 666.90 | 1720 | 582 | 546 | 0 | 1000 | 1204 |
| 667.17 | 1720 | 582 | 546 | 0 | 1000 | 1204 |
| 667.46 | 1700 | 576 | 540 | 0 | 1000 | 1204 |
| 667.73 | 1700 | 576 | 540 | 0 | 1000 | 1193 |